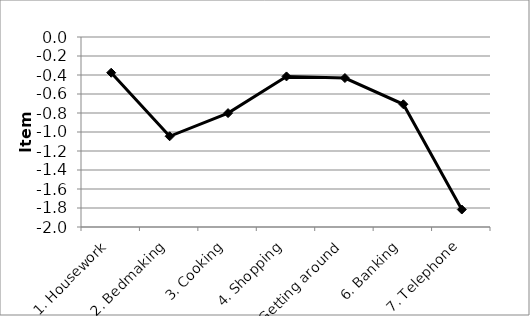
| Category | Series 0 |
|---|---|
| 1. Housework | -0.376 |
| 2. Bedmaking | -1.045 |
| 3. Cooking | -0.801 |
| 4. Shopping | -0.415 |
| 5. Getting around | -0.432 |
| 6. Banking | -0.708 |
| 7. Telephone | -1.816 |